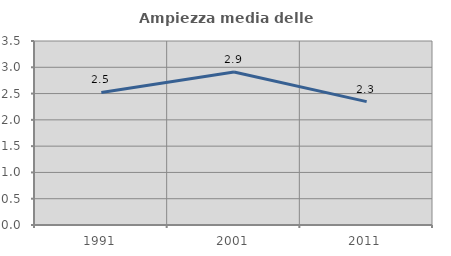
| Category | Ampiezza media delle famiglie |
|---|---|
| 1991.0 | 2.521 |
| 2001.0 | 2.911 |
| 2011.0 | 2.346 |